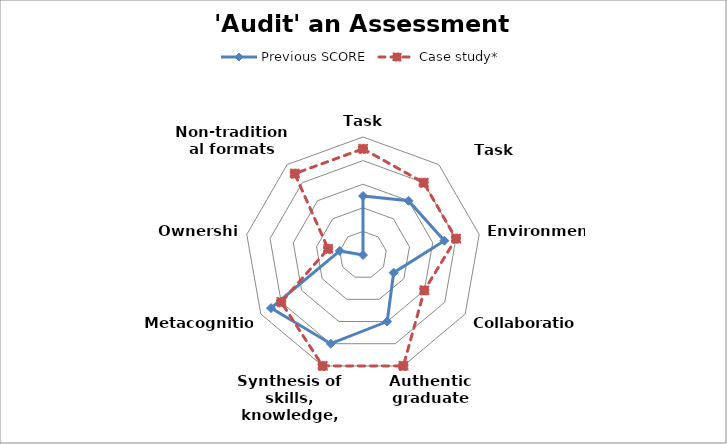
| Category | Previous SCORE | Case study* |
|---|---|---|
| Task relevance | 5 | 9 |
| Task structure | 6 | 8 |
| Environment | 7 | 8 |
| Collaboration | 3 | 6 |
| Authentic graduate task | 6 | 10 |
| Synthesis of skills, knowledge, attributes | 8 | 10 |
| Metacognition | 9 | 8 |
| Ownership | 2 | 3 |
| Non-traditional formats | 0 | 9 |